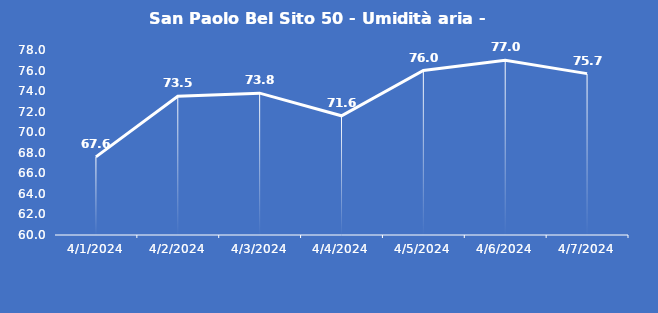
| Category | San Paolo Bel Sito 50 - Umidità aria - Grezzo (%) |
|---|---|
| 4/1/24 | 67.6 |
| 4/2/24 | 73.5 |
| 4/3/24 | 73.8 |
| 4/4/24 | 71.6 |
| 4/5/24 | 76 |
| 4/6/24 | 77 |
| 4/7/24 | 75.7 |